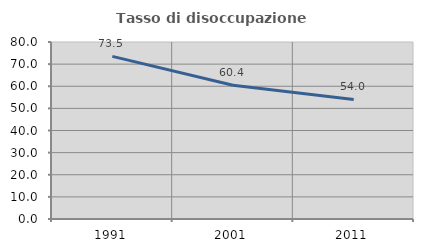
| Category | Tasso di disoccupazione giovanile  |
|---|---|
| 1991.0 | 73.51 |
| 2001.0 | 60.442 |
| 2011.0 | 54.023 |